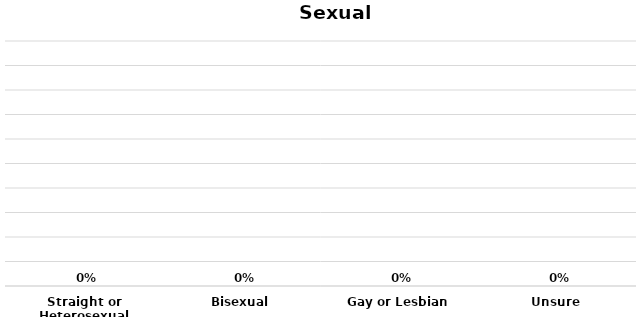
| Category | Series 0 |
|---|---|
| Straight or Heterosexual | 0 |
| Bisexual | 0 |
| Gay or Lesbian | 0 |
| Unsure | 0 |